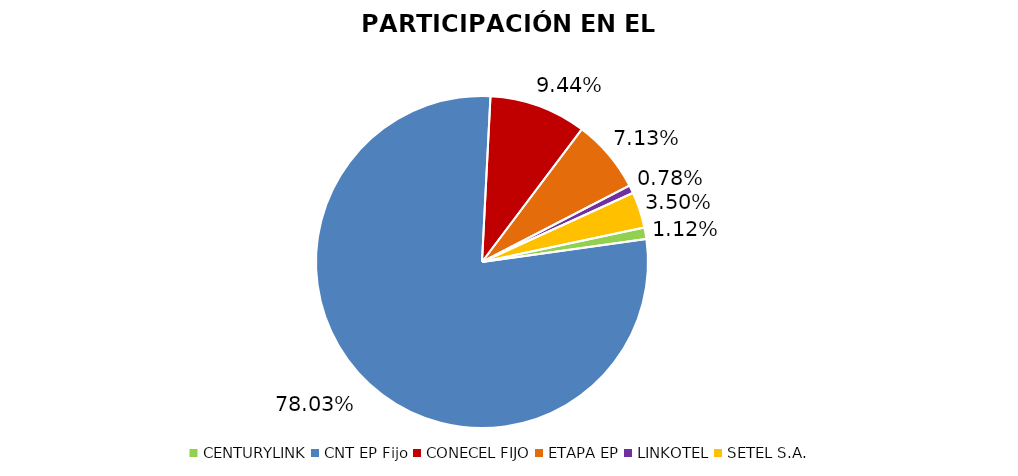
| Category | Participación en el Mercado |
|---|---|
| CENTURYLINK | 0.011 |
| CNT EP Fijo | 0.78 |
| CONECEL FIJO | 0.094 |
| ETAPA EP | 0.071 |
| LINKOTEL | 0.008 |
| SETEL S.A. | 0.035 |